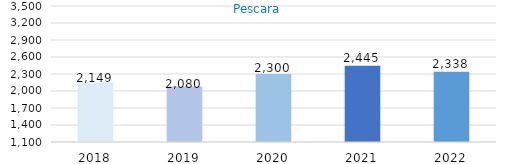
| Category | Series 0 |
|---|---|
| 2018.0 | 2149 |
| 2019.0 | 2080 |
| 2020.0 | 2300 |
| 2021.0 | 2445 |
| 2022.0 | 2338 |